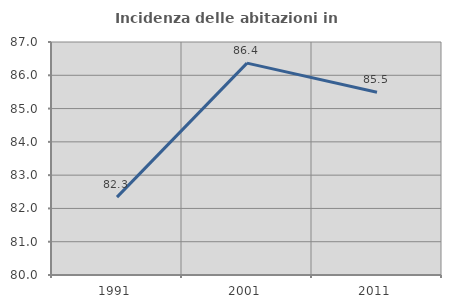
| Category | Incidenza delle abitazioni in proprietà  |
|---|---|
| 1991.0 | 82.339 |
| 2001.0 | 86.365 |
| 2011.0 | 85.491 |